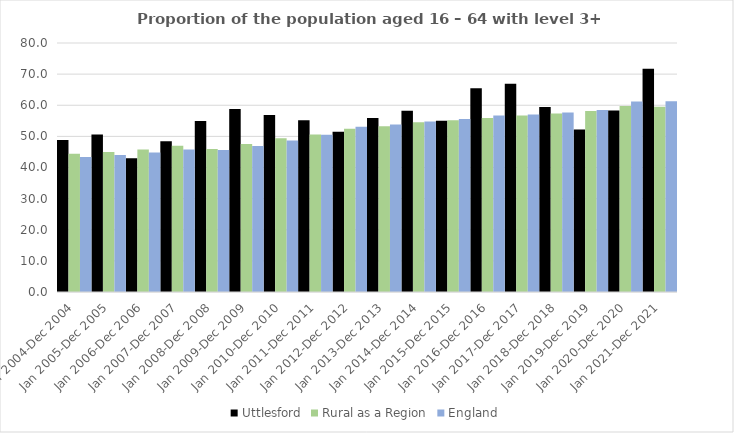
| Category | Uttlesford | Rural as a Region | England |
|---|---|---|---|
| Jan 2004-Dec 2004 | 48.8 | 44.405 | 43.4 |
| Jan 2005-Dec 2005 | 50.6 | 44.973 | 44 |
| Jan 2006-Dec 2006 | 43 | 45.774 | 44.8 |
| Jan 2007-Dec 2007 | 48.4 | 46.968 | 45.8 |
| Jan 2008-Dec 2008 | 54.9 | 45.964 | 45.6 |
| Jan 2009-Dec 2009 | 58.8 | 47.59 | 46.9 |
| Jan 2010-Dec 2010 | 56.9 | 49.362 | 48.7 |
| Jan 2011-Dec 2011 | 55.2 | 50.602 | 50.5 |
| Jan 2012-Dec 2012 | 51.5 | 52.439 | 53.1 |
| Jan 2013-Dec 2013 | 55.9 | 53.276 | 53.8 |
| Jan 2014-Dec 2014 | 58.2 | 54.57 | 54.8 |
| Jan 2015-Dec 2015 | 55 | 55.16 | 55.6 |
| Jan 2016-Dec 2016 | 65.5 | 55.941 | 56.7 |
| Jan 2017-Dec 2017 | 66.9 | 56.689 | 57 |
| Jan 2018-Dec 2018 | 59.4 | 57.389 | 57.7 |
| Jan 2019-Dec 2019 | 52.2 | 58.147 | 58.5 |
| Jan 2020-Dec 2020 | 58.3 | 59.771 | 61.2 |
| Jan 2021-Dec 2021 | 71.7 | 59.54 | 61.3 |